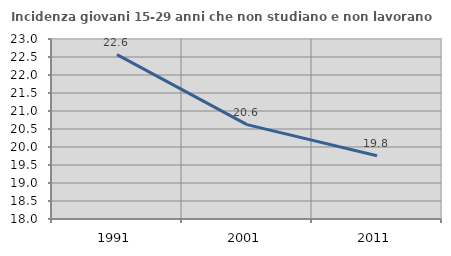
| Category | Incidenza giovani 15-29 anni che non studiano e non lavorano  |
|---|---|
| 1991.0 | 22.566 |
| 2001.0 | 20.621 |
| 2011.0 | 19.756 |